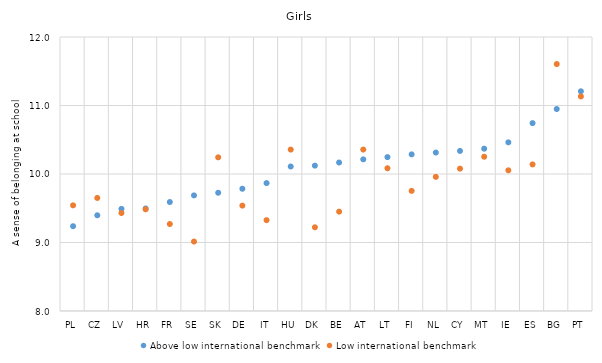
| Category | Above low international benchmark | Low international benchmark |
|---|---|---|
| PL | 9.238 | 9.543 |
| CZ | 9.397 | 9.65 |
| LV | 9.49 | 9.431 |
| HR | 9.497 | 9.484 |
| FR | 9.591 | 9.27 |
| SE | 9.688 | 9.014 |
| SK | 9.726 | 10.244 |
| DE | 9.785 | 9.538 |
| IT | 9.868 | 9.326 |
| HU | 10.109 | 10.356 |
| DK | 10.122 | 9.222 |
| BE | 10.168 | 9.451 |
| AT | 10.214 | 10.357 |
| LT | 10.246 | 10.084 |
| FI | 10.287 | 9.754 |
| NL | 10.313 | 9.958 |
| CY | 10.337 | 10.079 |
| MT | 10.37 | 10.252 |
| IE | 10.462 | 10.054 |
| ES | 10.743 | 10.14 |
| BG | 10.949 | 11.605 |
| PT | 11.207 | 11.132 |